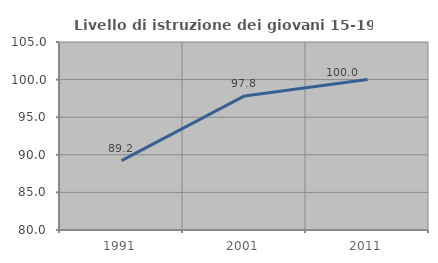
| Category | Livello di istruzione dei giovani 15-19 anni |
|---|---|
| 1991.0 | 89.231 |
| 2001.0 | 97.826 |
| 2011.0 | 100 |